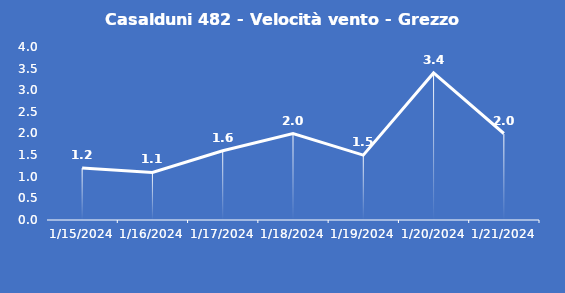
| Category | Casalduni 482 - Velocità vento - Grezzo (m/s) |
|---|---|
| 1/15/24 | 1.2 |
| 1/16/24 | 1.1 |
| 1/17/24 | 1.6 |
| 1/18/24 | 2 |
| 1/19/24 | 1.5 |
| 1/20/24 | 3.4 |
| 1/21/24 | 2 |